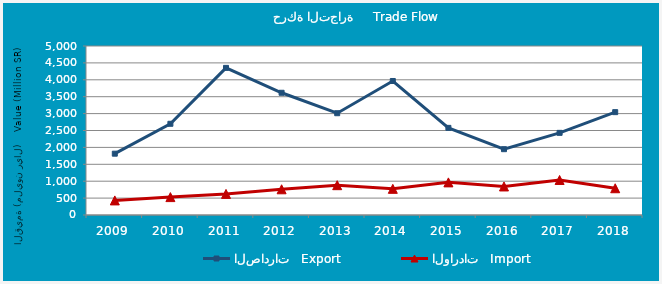
| Category | الصادرات   Export | الواردات   Import |
|---|---|---|
| 2009.0 | 1814267249 | 431408501 |
| 2010.0 | 2698586719 | 529612688 |
| 2011.0 | 4352573798 | 624388250 |
| 2012.0 | 3615981267 | 760554267 |
| 2013.0 | 3011155751 | 882397873 |
| 2014.0 | 3964685861 | 774293930 |
| 2015.0 | 2577797022 | 965141215 |
| 2016.0 | 1947552989 | 844459515 |
| 2017.0 | 2430535604 | 1036398660 |
| 2018.0 | 3042789705 | 791540263 |